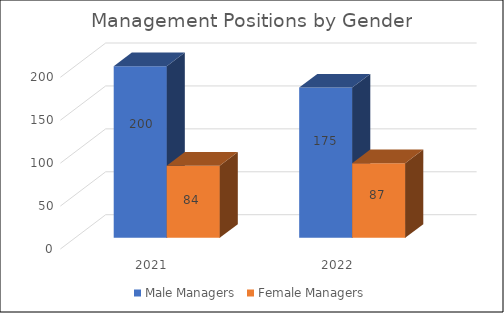
| Category | Male Managers | Female Managers |
|---|---|---|
| 2021.0 | 200 | 84 |
| 2022.0 | 175 | 87 |